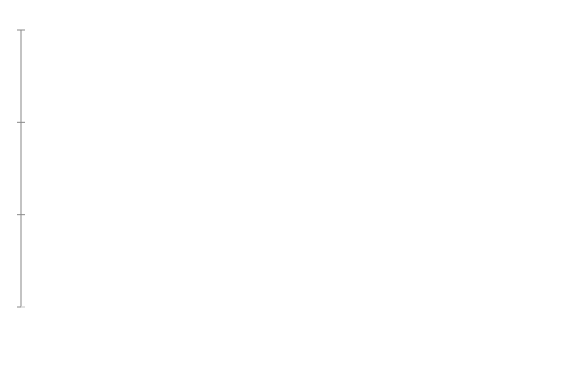
| Category | Foundation | Experienced | Leading |
|---|---|---|---|
|  | 0 | 0 | 0 |
|  | 0 | 0 | 0 |
|  | 0 | 0 | 0 |